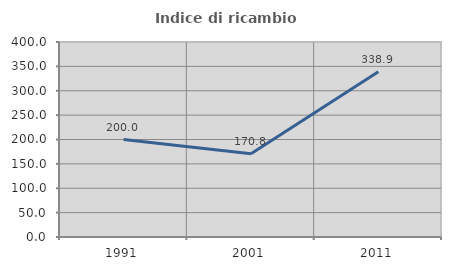
| Category | Indice di ricambio occupazionale  |
|---|---|
| 1991.0 | 200 |
| 2001.0 | 170.833 |
| 2011.0 | 338.889 |